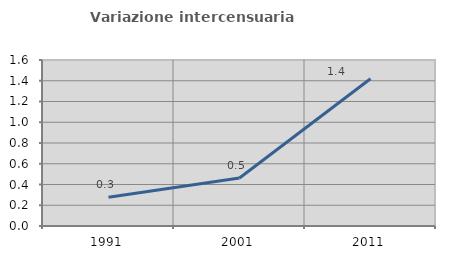
| Category | Variazione intercensuaria annua |
|---|---|
| 1991.0 | 0.278 |
| 2001.0 | 0.463 |
| 2011.0 | 1.419 |